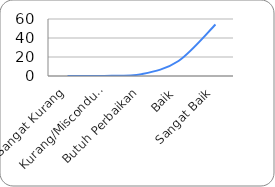
| Category | Pola Distribusi |
|---|---|
| Sangat Kurang | 0 |
| Kurang/Misconduct | 0.082 |
| Butuh Perbaikan | 1.975 |
| Baik | 15.799 |
| Sangat Baik | 54.167 |